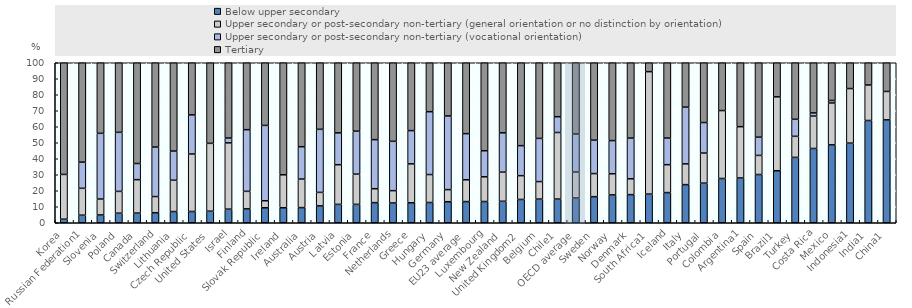
| Category | Below upper secondary | Upper secondary or post-secondary non-tertiary (general orientation or no distinction by orientation) | Upper secondary or post-secondary non-tertiary (vocational orientation) | Tertiary |
|---|---|---|---|---|
| Korea | 2.221 | 27.976 | 0 | 69.803 |
| Russian Federation1 | 4.721 | 16.81 | 16.379 | 62.09 |
| Slovenia | 4.88 | 9.939 | 41.075 | 44.106 |
| Poland | 5.974 | 13.633 | 36.909 | 43.484 |
| Canada | 6.027 | 20.911 | 10.097 | 62.965 |
| Switzerland | 6.279 | 10.091 | 30.935 | 52.696 |
| Lithuania | 7.004 | 19.565 | 18.244 | 55.187 |
| Czech Republic | 7.043 | 35.934 | 24.443 | 32.58 |
| United States | 7.22 | 42.4 | 0 | 50.38 |
| Israel | 8.501 | 41.438 | 3.018 | 47.042 |
| Finland | 8.677 | 10.953 | 38.549 | 41.821 |
| Slovak Republic | 9.361 | 4.393 | 47.087 | 39.158 |
| Ireland | 9.377 | 20.609 | 0 | 70.014 |
| Australia | 9.468 | 17.833 | 20.221 | 52.478 |
| Austria | 10.562 | 8.403 | 39.424 | 41.61 |
| Latvia | 11.484 | 24.796 | 19.908 | 43.811 |
| Estonia | 11.497 | 18.897 | 26.847 | 42.76 |
| France | 12.569 | 8.705 | 30.673 | 48.053 |
| Netherlands | 12.356 | 7.71 | 30.831 | 49.103 |
| Greece | 12.507 | 24.305 | 20.781 | 42.407 |
| Hungary | 12.66 | 17.474 | 39.277 | 30.589 |
| Germany | 13.136 | 7.572 | 46.031 | 33.26 |
| EU23 average | 13.231 | 13.623 | 28.836 | 44.309 |
| Luxembourg | 13.263 | 15.442 | 16.306 | 54.99 |
| New Zealand | 13.414 | 18.213 | 24.582 | 43.792 |
| United Kingdom2 | 14.552 | 14.886 | 18.752 | 51.81 |
| Belgium | 14.785 | 10.939 | 26.993 | 47.283 |
| Chile1 | 14.797 | 41.618 | 9.859 | 33.726 |
| OECD average | 15.464 | 16.222 | 23.778 | 44.983 |
| Sweden | 16.315 | 14.416 | 20.895 | 48.373 |
| Norway | 17.414 | 13.216 | 20.712 | 48.659 |
| Denmark | 17.583 | 9.897 | 25.422 | 47.098 |
| South Africa1 | 17.919 | 76.512 | 0 | 5.569 |
| Iceland | 18.856 | 17.439 | 16.643 | 47.061 |
| Italy | 23.823 | 12.982 | 35.451 | 27.745 |
| Portugal | 24.757 | 18.79 | 19.086 | 37.367 |
| Colombia | 27.663 | 42.463 | 0 | 29.874 |
| Argentina1 | 27.989 | 32.053 | 0 | 39.958 |
| Spain | 30.153 | 11.93 | 11.409 | 46.508 |
| Brazil1 | 32.511 | 46.174 | 0 | 21.315 |
| Turkey | 40.863 | 13.157 | 10.654 | 35.325 |
| Costa Rica | 46.431 | 20.232 | 1.991 | 31.347 |
| Mexico | 48.69 | 26.156 | 1.567 | 23.587 |
| Indonesia1 | 49.758 | 34.112 | 0 | 16.13 |
| India1 | 63.914 | 22.186 | 0 | 13.9 |
| China1 | 64.304 | 17.748 | 0 | 17.949 |